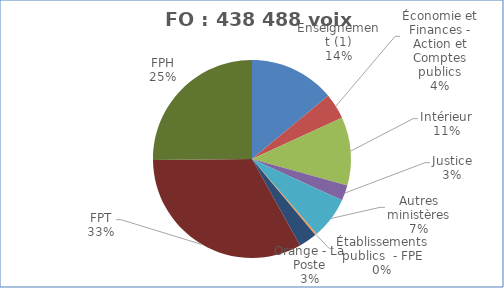
| Category | Nombre de voix |
|---|---|
| Enseignement (1) | 61299 |
| Économie et Finances - Action et Comptes publics | 18292 |
| Intérieur | 48963 |
| Justice | 11049 |
| Autres ministères | 29910.5 |
| Établissements publics  - FPE | 1319 |
| Orange - La Poste | 13016 |
| FPT | 144393 |
| FPH | 110246 |